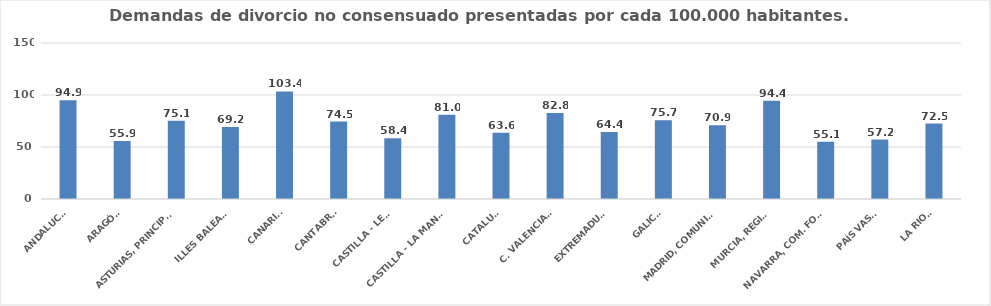
| Category | Series 0 |
|---|---|
| ANDALUCÍA | 94.884 |
| ARAGÓN | 55.869 |
| ASTURIAS, PRINCIPADO | 75.148 |
| ILLES BALEARS | 69.179 |
| CANARIAS | 103.412 |
| CANTABRIA | 74.479 |
| CASTILLA - LEÓN | 58.374 |
| CASTILLA - LA MANCHA | 80.99 |
| CATALUÑA | 63.599 |
| C. VALENCIANA | 82.778 |
| EXTREMADURA | 64.374 |
| GALICIA | 75.712 |
| MADRID, COMUNIDAD | 70.856 |
| MURCIA, REGIÓN | 94.394 |
| NAVARRA, COM. FORAL | 55.111 |
| PAÍS VASCO | 57.197 |
| LA RIOJA | 72.524 |